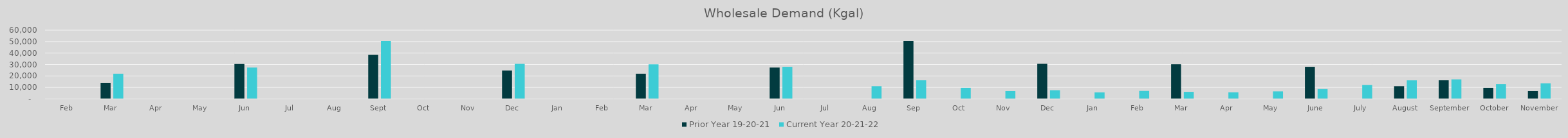
| Category | Prior Year 19-20-21 | Current Year 20-21-22 |
|---|---|---|
| Feb | 0 | 0 |
| Mar | 14013.78 | 21965.02 |
| Apr | 0 | 0 |
| May | 0 | 0 |
| Jun | 30443.6 | 27331 |
| Jul | 0 | 0 |
| Aug | 0 | 0 |
| Sep | 38376.14 | 50400.24 |
| Oct | 0 | 0 |
| Nov | 0 | 0 |
| Dec | 24784.98 | 30611.9 |
| Jan | 0 | 0 |
| Feb | 0 | 0 |
| Mar | 21965.02 | 30196.76 |
| Apr | 0 | 0 |
| May | 0 | 0 |
| Jun | 27331 | 27993.9 |
| Jul | 0 | 0 |
| Aug | 0 | 11056.179 |
| Sep | 50400.24 | 16202.763 |
| Oct | 0 | 9585.62 |
| Nov | 0 | 6754.44 |
| Dec | 30611.9 | 7547.32 |
| Jan | 0 | 5643.66 |
| Feb | 0 | 6907.78 |
| Mar | 30196.76 | 6111.16 |
| Apr | 0 | 5707.24 |
| May | 0 | 6522.56 |
| June | 27993.9 | 8549.64 |
| July | 0 | 12192.4 |
| August | 11056.179 | 16164.28 |
| September | 16202.763 | 17013.35 |
| October | 9585.62 | 12849.024 |
| November | 6754.44 | 13564.374 |